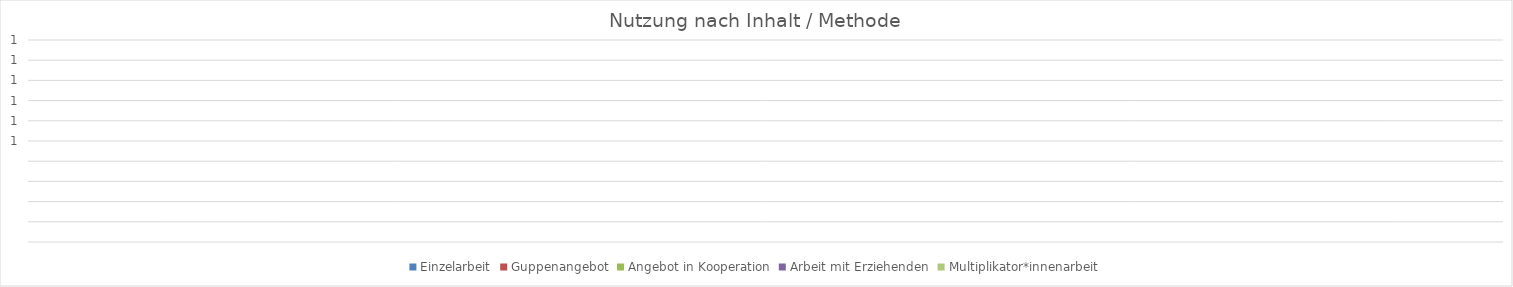
| Category | Einzelarbeit | Guppenangebot | Angebot in Kooperation | Arbeit mit Erziehenden | Multiplikator*innenarbeit |
|---|---|---|---|---|---|
| 0 | 0 | 0 | 0 | 0 | 0 |